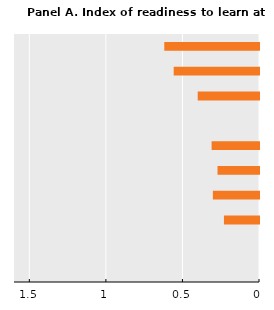
| Category | Series 0 |
|---|---|
| 0 | 0 |
| 1 | 0 |
| 2 | 0.229 |
| 3 | 0.301 |
| 4 | 0.271 |
| 5 | 0.309 |
| 6 | 0 |
| 7 | 0.4 |
| 8 | 0.557 |
| 9 | 0.619 |